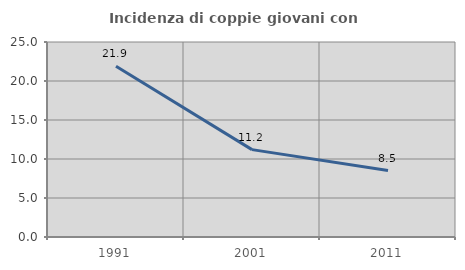
| Category | Incidenza di coppie giovani con figli |
|---|---|
| 1991.0 | 21.885 |
| 2001.0 | 11.201 |
| 2011.0 | 8.519 |